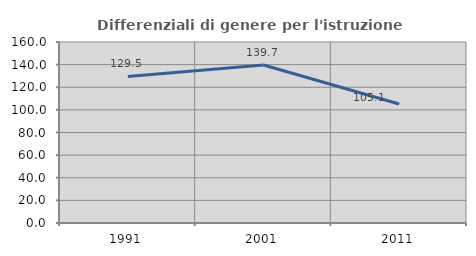
| Category | Differenziali di genere per l'istruzione superiore |
|---|---|
| 1991.0 | 129.515 |
| 2001.0 | 139.659 |
| 2011.0 | 105.139 |